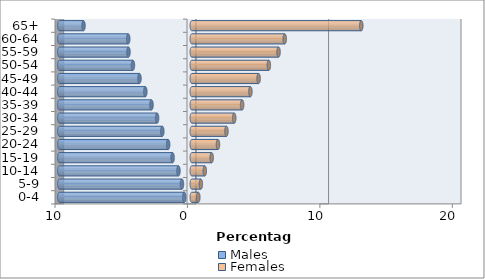
| Category | Males | Females |
|---|---|---|
| 0-4 | -0.563 | 0.492 |
| 5-9 | -0.742 | 0.683 |
| 10-14 | -1.007 | 0.98 |
| 15-19 | -1.449 | 1.501 |
| 20-24 | -1.784 | 1.978 |
| 25-29 | -2.226 | 2.617 |
| 30-34 | -2.619 | 3.204 |
| 35-39 | -3.043 | 3.8 |
| 40-44 | -3.508 | 4.426 |
| 45-49 | -3.95 | 5.045 |
| 50-54 | -4.444 | 5.818 |
| 55-59 | -4.78 | 6.55 |
| 60-64 | -4.798 | 7.017 |
| 65+ | -8.176 | 12.799 |